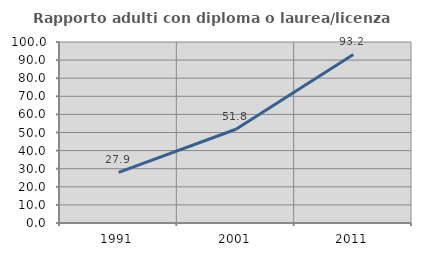
| Category | Rapporto adulti con diploma o laurea/licenza media  |
|---|---|
| 1991.0 | 27.941 |
| 2001.0 | 51.807 |
| 2011.0 | 93.151 |